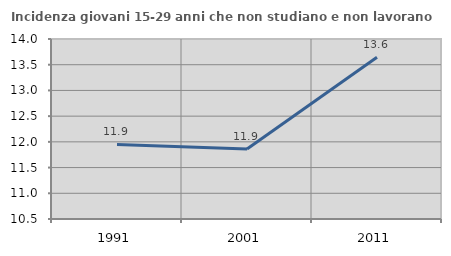
| Category | Incidenza giovani 15-29 anni che non studiano e non lavorano  |
|---|---|
| 1991.0 | 11.95 |
| 2001.0 | 11.86 |
| 2011.0 | 13.644 |